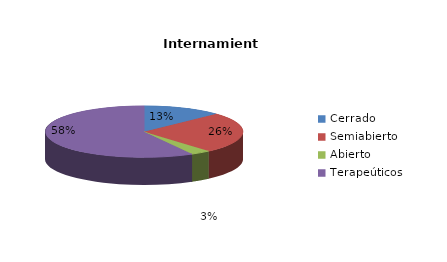
| Category | Series 0 |
|---|---|
| Cerrado | 8 |
| Semiabierto | 16 |
| Abierto | 2 |
| Terapeúticos | 36 |